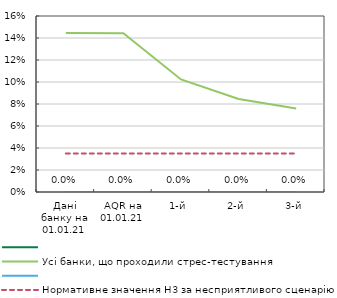
| Category | Series 0 | Усі банки, що проходили стрес-тестування | Series 3 | Нормативне значення Н3 за несприятливого сценарію |
|---|---|---|---|---|
| Дані банку на 01.01.21 | 0 | 0.145 | 0 | 0.035 |
| AQR на 01.01.21 | 0 | 0.144 | 0 | 0.035 |
| 1-й | 0 | 0.102 | 0 | 0.035 |
| 2-й | 0 | 0.085 | 0 | 0.035 |
| 3-й | 0 | 0.076 | 0 | 0.035 |